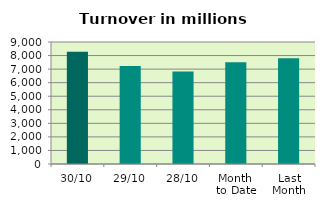
| Category | Series 0 |
|---|---|
| 30/10 | 8283.605 |
| 29/10 | 7223.051 |
| 28/10 | 6829.389 |
| Month 
to Date | 7500.279 |
| Last
Month | 7802.515 |